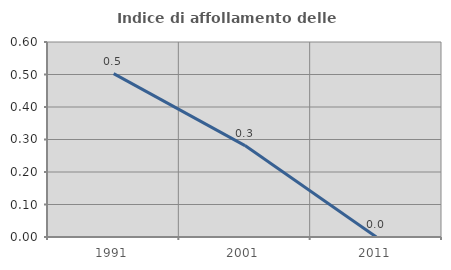
| Category | Indice di affollamento delle abitazioni  |
|---|---|
| 1991.0 | 0.503 |
| 2001.0 | 0.281 |
| 2011.0 | 0 |